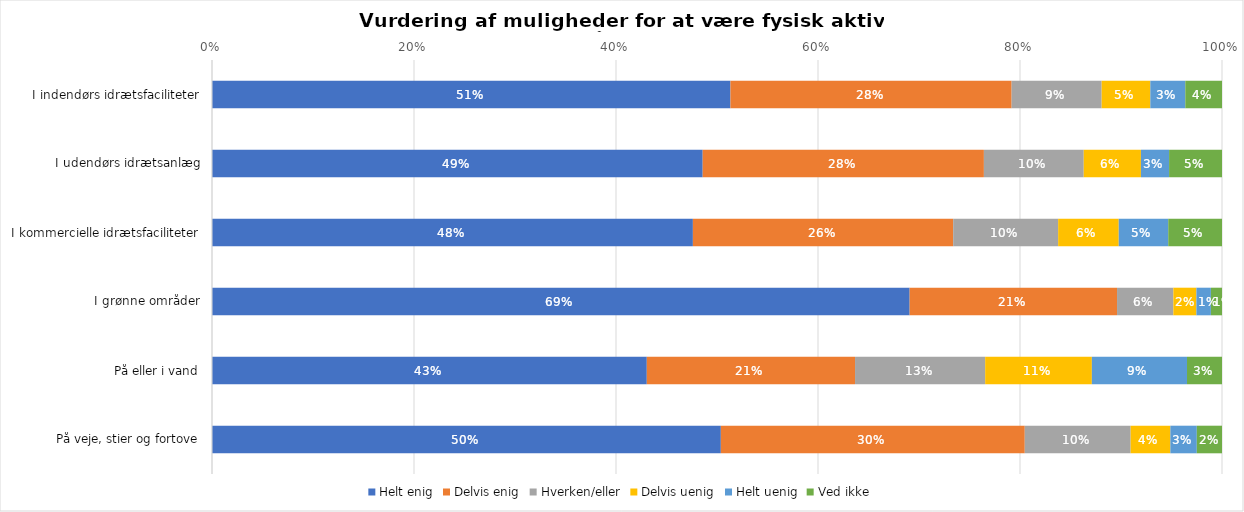
| Category | Helt enig | Delvis enig | Hverken/eller | Delvis uenig | Helt uenig | Ved ikke |
|---|---|---|---|---|---|---|
| I indendørs idrætsfaciliteter | 0.513 | 0.278 | 0.089 | 0.048 | 0.035 | 0.036 |
| I udendørs idrætsanlæg | 0.486 | 0.278 | 0.099 | 0.057 | 0.028 | 0.052 |
| I kommercielle idrætsfaciliteter | 0.476 | 0.258 | 0.104 | 0.06 | 0.049 | 0.053 |
| I grønne områder | 0.691 | 0.205 | 0.056 | 0.023 | 0.014 | 0.011 |
| På eller i vand | 0.431 | 0.206 | 0.129 | 0.106 | 0.094 | 0.035 |
| På veje, stier og fortove | 0.504 | 0.301 | 0.105 | 0.039 | 0.026 | 0.025 |